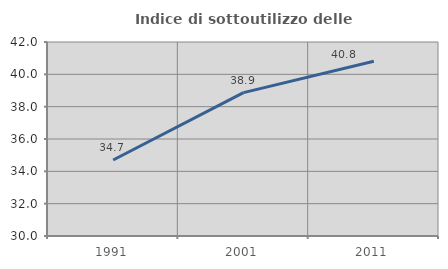
| Category | Indice di sottoutilizzo delle abitazioni  |
|---|---|
| 1991.0 | 34.701 |
| 2001.0 | 38.871 |
| 2011.0 | 40.813 |